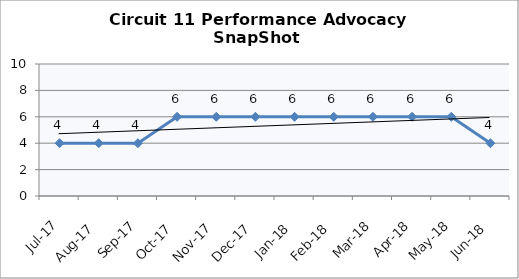
| Category | Circuit 11 |
|---|---|
| Jul-17 | 4 |
| Aug-17 | 4 |
| Sep-17 | 4 |
| Oct-17 | 6 |
| Nov-17 | 6 |
| Dec-17 | 6 |
| Jan-18 | 6 |
| Feb-18 | 6 |
| Mar-18 | 6 |
| Apr-18 | 6 |
| May-18 | 6 |
| Jun-18 | 4 |